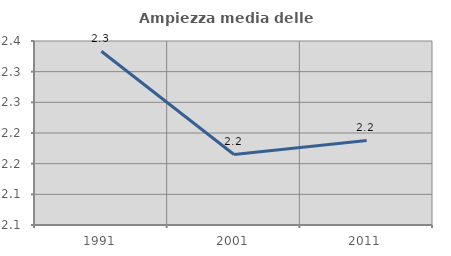
| Category | Ampiezza media delle famiglie |
|---|---|
| 1991.0 | 2.333 |
| 2001.0 | 2.165 |
| 2011.0 | 2.188 |